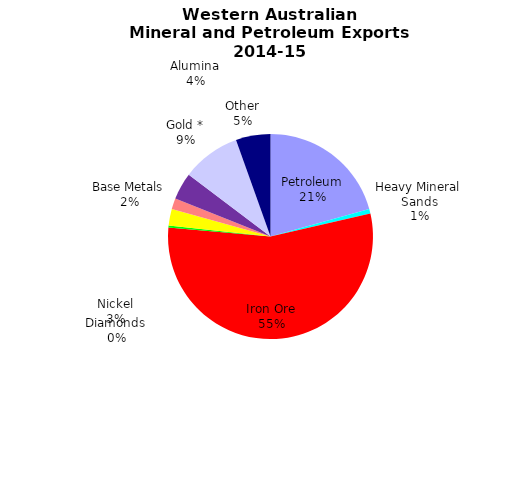
| Category | Series 1 | Series 0 |
|---|---|---|
| 0 | 20.233 | 20.233 |
| 1 | 0.695 | 0.695 |
| 2 | 53.765 | 53.765 |
| 3 | 0.337 | 0.337 |
| 4 | 2.556 | 2.556 |
| 5 | 1.669 | 1.669 |
| 6 | 4.174 | 4.174 |
| 7 | 9.021 | 9.021 |
| 8 | 5.342 | 5.342 |